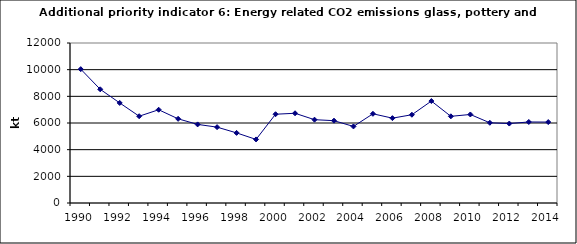
| Category | Energy related CO2 emissions from glass, pottery and building materials, kt |
|---|---|
| 1990 | 10038.446 |
| 1991 | 8526.893 |
| 1992 | 7505.479 |
| 1993 | 6508.81 |
| 1994 | 6994.038 |
| 1995 | 6312.66 |
| 1996 | 5894.729 |
| 1997 | 5689.333 |
| 1998 | 5257.576 |
| 1999 | 4767.593 |
| 2000 | 6657.471 |
| 2001 | 6729.656 |
| 2002 | 6248.583 |
| 2003 | 6173.77 |
| 2004 | 5742.55 |
| 2005 | 6690.145 |
| 2006 | 6363.512 |
| 2007 | 6619.904 |
| 2008 | 7646.362 |
| 2009 | 6501.349 |
| 2010 | 6639.4 |
| 2011 | 6015.752 |
| 2012 | 5958.103 |
| 2013 | 6077.045 |
| 2014 | 6069.692 |